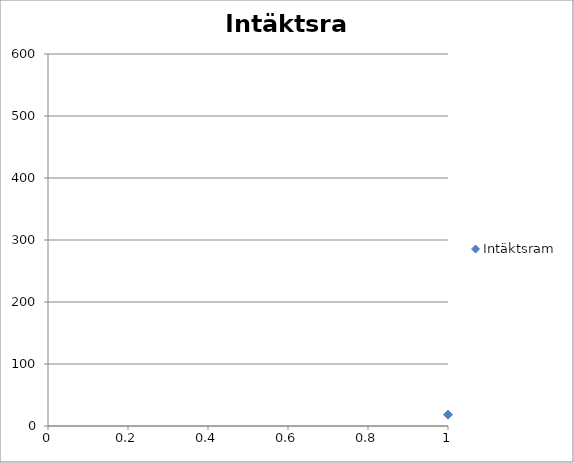
| Category | Intäktsram |
|---|---|
| 0 | 18.273 |
| 1 | 36.25 |
| 2 | 53.931 |
| 3 | 71.316 |
| 4 | 88.405 |
| 5 | 105.197 |
| 6 | 121.694 |
| 7 | 137.895 |
| 8 | 153.799 |
| 9 | 169.408 |
| 10 | 184.72 |
| 11 | 199.737 |
| 12 | 214.457 |
| 13 | 228.882 |
| 14 | 243.01 |
| 15 | 256.842 |
| 16 | 270.378 |
| 17 | 283.618 |
| 18 | 296.562 |
| 19 | 309.211 |
| 20 | 321.562 |
| 21 | 333.618 |
| 22 | 345.378 |
| 23 | 356.842 |
| 24 | 368.01 |
| 25 | 378.882 |
| 26 | 389.457 |
| 27 | 399.737 |
| 28 | 409.72 |
| 29 | 419.408 |
| 30 | 428.799 |
| 31 | 437.895 |
| 32 | 446.694 |
| 33 | 455.197 |
| 34 | 463.405 |
| 35 | 471.316 |
| 36 | 478.931 |
| 37 | 486.25 |
| 38 | 493.273 |
| 39 | 500 |
| 40 | 500 |
| 41 | 500 |
| 42 | 500 |
| 43 | 500 |
| 44 | 500 |
| 45 | 500 |
| 46 | 500 |
| 47 | 500 |
| 48 | 500 |
| 49 | 500 |
| 50 | 506.944 |
| 51 | 513.775 |
| 52 | 520.494 |
| 53 | 520.156 |
| 54 | 519.819 |
| 55 | 519.481 |
| 56 | 519.144 |
| 57 | 518.806 |
| 58 | 518.469 |
| 59 | 518.131 |
| 60 | 517.794 |
| 61 | 517.456 |
| 62 | 517.119 |
| 63 | 516.781 |
| 64 | 516.444 |
| 65 | 516.106 |
| 66 | 515.769 |
| 67 | 515.431 |
| 68 | 515.094 |
| 69 | 514.756 |
| 70 | 514.419 |
| 71 | 514.081 |
| 72 | 513.744 |
| 73 | 513.406 |
| 74 | 513.069 |
| 75 | 512.731 |
| 76 | 512.394 |
| 77 | 512.056 |
| 78 | 511.719 |
| 79 | 511.381 |
| 80 | 511.044 |
| 81 | 510.706 |
| 82 | 510.369 |
| 83 | 510.031 |
| 84 | 509.694 |
| 85 | 509.356 |
| 86 | 509.019 |
| 87 | 508.681 |
| 88 | 508.344 |
| 89 | 508.006 |
| 90 | 505.225 |
| 91 | 502.556 |
| 92 | 500 |
| 93 | 500 |
| 94 | 500 |
| 95 | 500 |
| 96 | 500 |
| 97 | 500 |
| 98 | 500 |
| 99 | 500 |
| 100 | 500 |
| 101 | 500 |
| 102 | 500 |
| 103 | 500 |
| 104 | 500 |
| 105 | 500 |
| 106 | 500 |
| 107 | 500 |
| 108 | 500 |
| 109 | 500 |
| 110 | 500 |
| 111 | 500 |
| 112 | 500 |
| 113 | 500 |
| 114 | 500 |
| 115 | 500 |
| 116 | 500 |
| 117 | 500 |
| 118 | 500 |
| 119 | 500 |
| 120 | 500 |
| 121 | 500 |
| 122 | 500 |
| 123 | 500 |
| 124 | 500 |
| 125 | 500 |
| 126 | 500 |
| 127 | 500 |
| 128 | 500 |
| 129 | 500 |
| 130 | 500 |
| 131 | 500 |
| 132 | 500 |
| 133 | 500 |
| 134 | 500 |
| 135 | 500 |
| 136 | 500 |
| 137 | 500 |
| 138 | 500 |
| 139 | 500 |
| 140 | 500 |
| 141 | 500 |
| 142 | 500 |
| 143 | 500 |
| 144 | 500 |
| 145 | 500 |
| 146 | 500 |
| 147 | 500 |
| 148 | 500 |
| 149 | 500 |
| 150 | 500 |
| 151 | 500 |
| 152 | 500 |
| 153 | 500 |
| 154 | 500 |
| 155 | 500 |
| 156 | 500 |
| 157 | 500 |
| 158 | 500 |
| 159 | 500 |
| 160 | 500 |
| 161 | 500 |
| 162 | 500 |
| 163 | 500 |
| 164 | 500 |
| 165 | 500 |
| 166 | 500 |
| 167 | 500 |
| 168 | 500 |
| 169 | 500 |
| 170 | 500 |
| 171 | 500 |
| 172 | 500 |
| 173 | 500 |
| 174 | 500 |
| 175 | 500 |
| 176 | 500 |
| 177 | 500 |
| 178 | 500 |
| 179 | 500 |
| 180 | 500 |
| 181 | 500 |
| 182 | 500 |
| 183 | 500 |
| 184 | 500 |
| 185 | 500 |
| 186 | 500 |
| 187 | 500 |
| 188 | 500 |
| 189 | 500 |
| 190 | 500 |
| 191 | 500 |
| 192 | 500 |
| 193 | 500 |
| 194 | 500 |
| 195 | 500 |
| 196 | 500 |
| 197 | 500 |
| 198 | 500 |
| 199 | 500 |